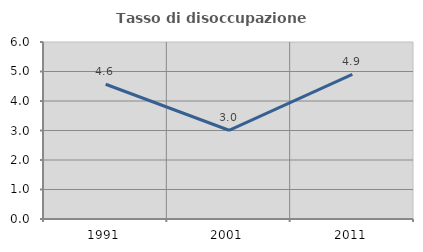
| Category | Tasso di disoccupazione giovanile  |
|---|---|
| 1991.0 | 4.569 |
| 2001.0 | 3.008 |
| 2011.0 | 4.902 |